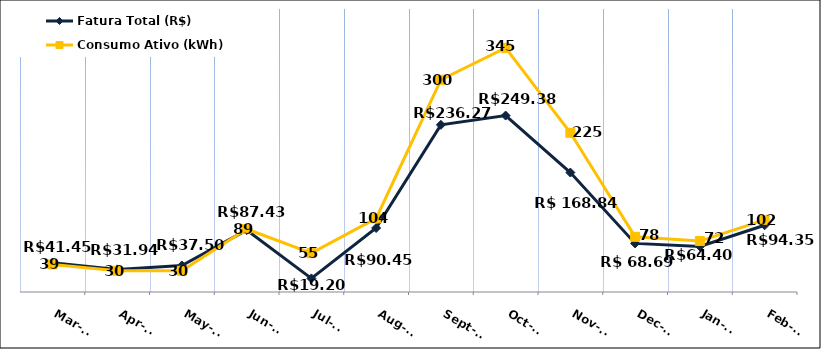
| Category | Fatura Total (R$) |
|---|---|
| 2022-03-01 | 41.45 |
| 2022-04-01 | 31.94 |
| 2022-05-01 | 37.5 |
| 2022-06-01 | 87.43 |
| 2022-07-01 | 19.2 |
| 2022-08-01 | 90.45 |
| 2022-09-01 | 236.27 |
| 2022-10-01 | 249.38 |
| 2022-11-01 | 168.84 |
| 2022-12-01 | 68.69 |
| 2023-01-01 | 64.4 |
| 2023-02-01 | 94.35 |